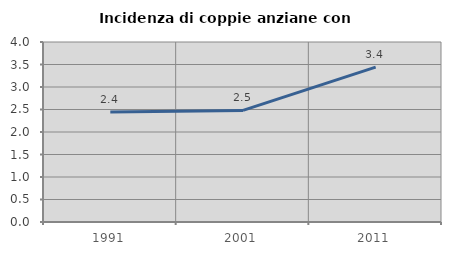
| Category | Incidenza di coppie anziane con figli |
|---|---|
| 1991.0 | 2.443 |
| 2001.0 | 2.48 |
| 2011.0 | 3.441 |